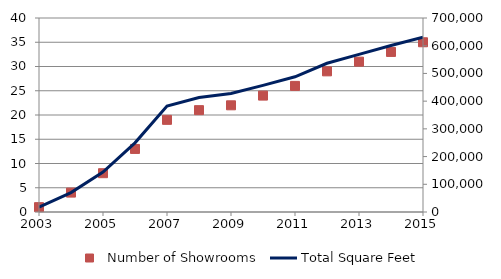
| Category | Number of Showrooms |
|---|---|
| 2003.0 | 1 |
| 2004.0 | 4 |
| 2005.0 | 8 |
| 2006.0 | 13 |
| 2007.0 | 19 |
| 2008.0 | 21 |
| 2009.0 | 22 |
| 2010.0 | 24 |
| 2011.0 | 26 |
| 2012.0 | 29 |
| 2013.0 | 31 |
| 2014.0 | 33 |
| 2015.0 | 35 |